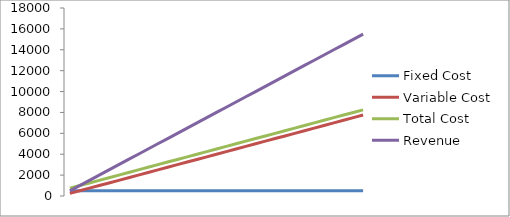
| Category | Fixed Cost | Variable Cost | Total Cost | Revenue |
|---|---|---|---|---|
| 100.0 | 500 | 250 | 750 | 500 |
| 200.0 | 500 | 500 | 1000 | 1000 |
| 300.0 | 500 | 750 | 1250 | 1500 |
| 400.0 | 500 | 1000 | 1500 | 2000 |
| 500.0 | 500 | 1250 | 1750 | 2500 |
| 600.0 | 500 | 1500 | 2000 | 3000 |
| 700.0 | 500 | 1750 | 2250 | 3500 |
| 800.0 | 500 | 2000 | 2500 | 4000 |
| 900.0 | 500 | 2250 | 2750 | 4500 |
| 1000.0 | 500 | 2500 | 3000 | 5000 |
| 1100.0 | 500 | 2750 | 3250 | 5500 |
| 1200.0 | 500 | 3000 | 3500 | 6000 |
| 1300.0 | 500 | 3250 | 3750 | 6500 |
| 1400.0 | 500 | 3500 | 4000 | 7000 |
| 1500.0 | 500 | 3750 | 4250 | 7500 |
| 1600.0 | 500 | 4000 | 4500 | 8000 |
| 1700.0 | 500 | 4250 | 4750 | 8500 |
| 1800.0 | 500 | 4500 | 5000 | 9000 |
| 1900.0 | 500 | 4750 | 5250 | 9500 |
| 2000.0 | 500 | 5000 | 5500 | 10000 |
| 2100.0 | 500 | 5250 | 5750 | 10500 |
| 2200.0 | 500 | 5500 | 6000 | 11000 |
| 2300.0 | 500 | 5750 | 6250 | 11500 |
| 2400.0 | 500 | 6000 | 6500 | 12000 |
| 2500.0 | 500 | 6250 | 6750 | 12500 |
| 2600.0 | 500 | 6500 | 7000 | 13000 |
| 2700.0 | 500 | 6750 | 7250 | 13500 |
| 2800.0 | 500 | 7000 | 7500 | 14000 |
| 2900.0 | 500 | 7250 | 7750 | 14500 |
| 3000.0 | 500 | 7500 | 8000 | 15000 |
| 3100.0 | 500 | 7750 | 8250 | 15500 |